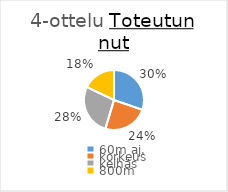
| Category | Series 0 |
|---|---|
| 60m aj. | 330 |
| korkeus | 265 |
| keihäs | 299 |
| 800m | 195 |